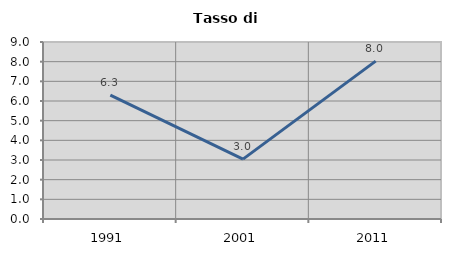
| Category | Tasso di disoccupazione   |
|---|---|
| 1991.0 | 6.302 |
| 2001.0 | 3.043 |
| 2011.0 | 8.025 |